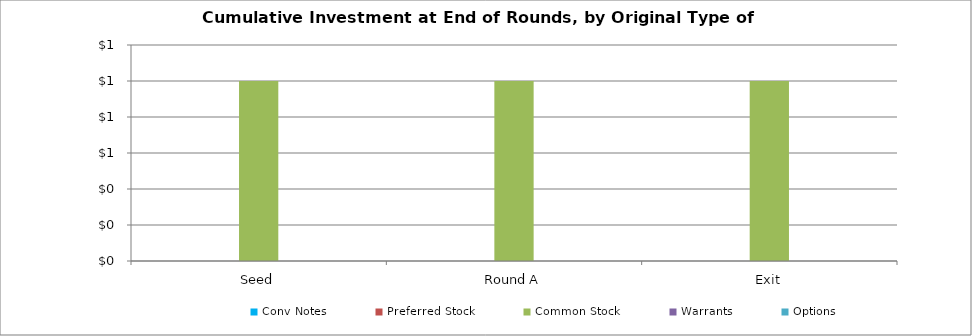
| Category | Conv Notes | Preferred Stock | Common Stock | Warrants | Options |
|---|---|---|---|---|---|
| Seed | 0 | 0 | 1 | 0 | 0 |
| Round A | 0 | 0 | 1 | 0 | 0 |
| Exit | 0 | 0 | 1 | 0 | 0 |